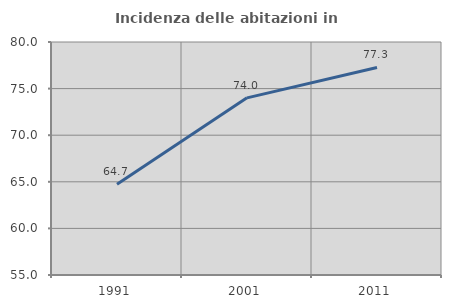
| Category | Incidenza delle abitazioni in proprietà  |
|---|---|
| 1991.0 | 64.748 |
| 2001.0 | 74.007 |
| 2011.0 | 77.273 |